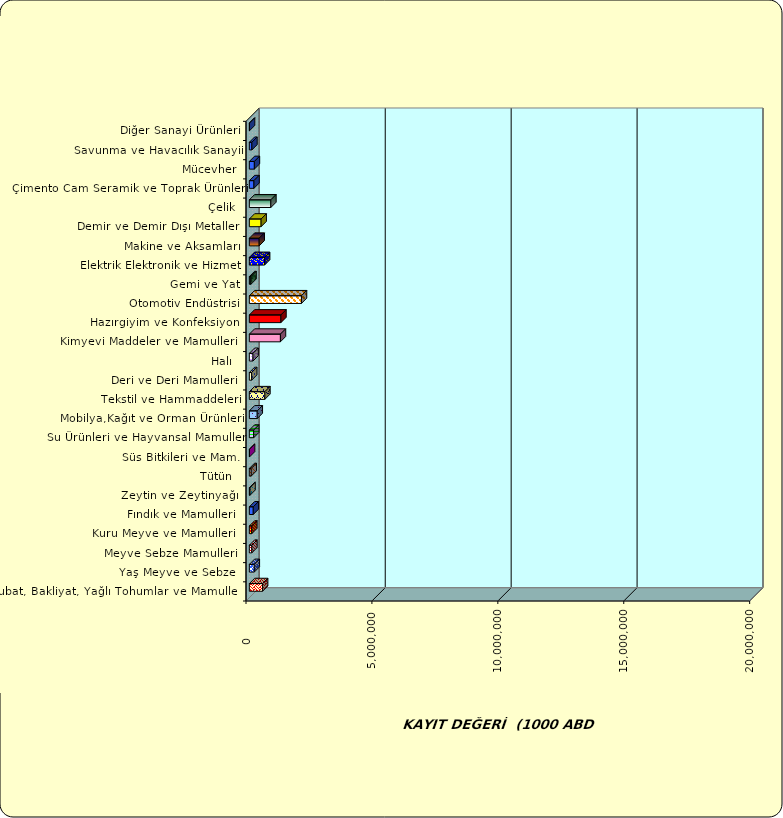
| Category | Series 0 |
|---|---|
|  Hububat, Bakliyat, Yağlı Tohumlar ve Mamulleri  | 525488.723 |
|  Yaş Meyve ve Sebze   | 195264.868 |
|  Meyve Sebze Mamulleri  | 98603.988 |
|  Kuru Meyve ve Mamulleri   | 96608.672 |
|  Fındık ve Mamulleri  | 155796.048 |
|  Zeytin ve Zeytinyağı  | 25097.256 |
|  Tütün  | 72553.879 |
|  Süs Bitkileri ve Mam. | 7168.697 |
|  Su Ürünleri ve Hayvansal Mamuller | 171675.016 |
|  Mobilya,Kağıt ve Orman Ürünleri | 312958.827 |
|  Tekstil ve Hammaddeleri | 615857.928 |
|  Deri ve Deri Mamulleri  | 90974.007 |
|  Halı  | 146076.16 |
|  Kimyevi Maddeler ve Mamulleri   | 1233868.473 |
|  Hazırgiyim ve Konfeksiyon  | 1253007.134 |
|  Otomotiv Endüstrisi | 2069424.101 |
|  Gemi ve Yat | 65125.64 |
|  Elektrik Elektronik ve Hizmet | 605118.674 |
|  Makine ve Aksamları | 390501.364 |
|  Demir ve Demir Dışı Metaller  | 467108.719 |
|  Çelik | 853780.053 |
|  Çimento Cam Seramik ve Toprak Ürünleri | 183156.51 |
|  Mücevher | 199462.252 |
|  Savunma ve Havacılık Sanayii | 100290.569 |
|  Diğer Sanayi Ürünleri | 5836.535 |